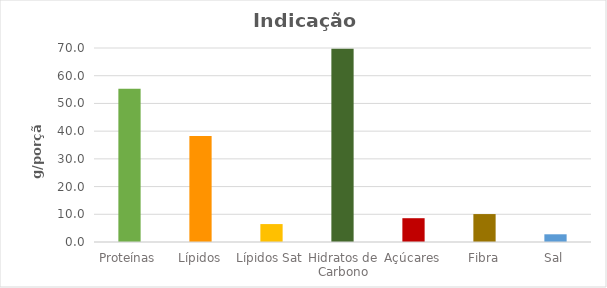
| Category | Series 0 |
|---|---|
| Proteínas | 55.333 |
| Lípidos | 38.234 |
| Lípidos Sat | 6.467 |
| Hidratos de Carbono | 69.742 |
| Açúcares | 8.587 |
| Fibra | 10.077 |
| Sal | 2.783 |